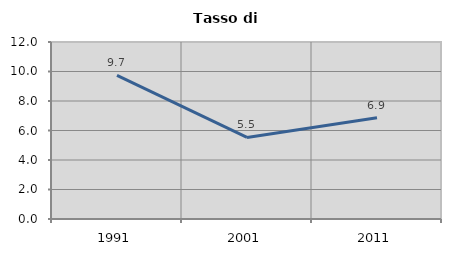
| Category | Tasso di disoccupazione   |
|---|---|
| 1991.0 | 9.741 |
| 2001.0 | 5.53 |
| 2011.0 | 6.858 |